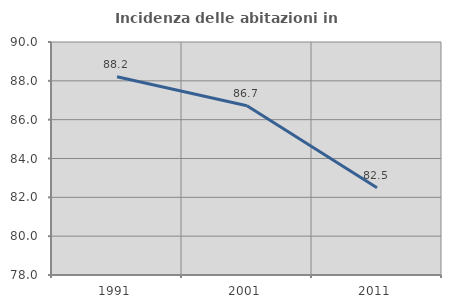
| Category | Incidenza delle abitazioni in proprietà  |
|---|---|
| 1991.0 | 88.214 |
| 2001.0 | 86.719 |
| 2011.0 | 82.489 |